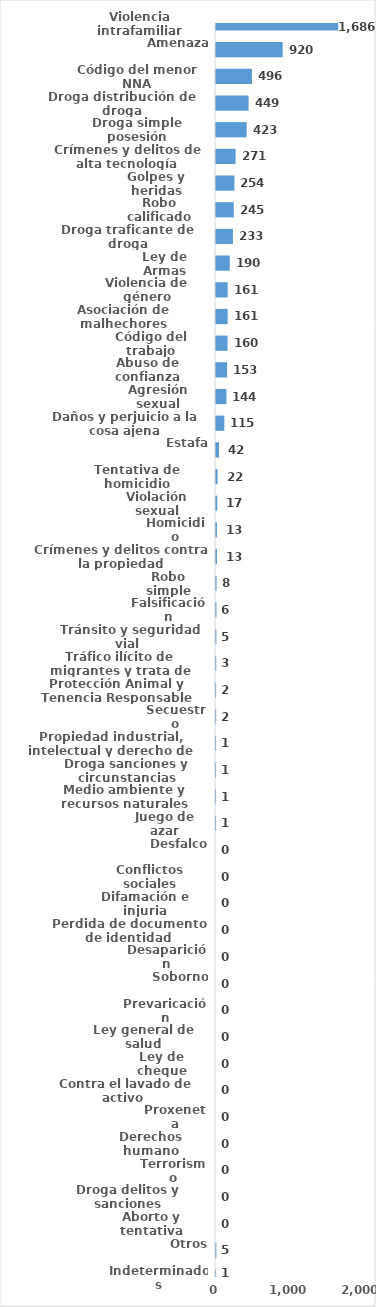
| Category | Series 0 |
|---|---|
| Violencia intrafamiliar | 1686 |
| Amenaza | 920 |
| Código del menor NNA | 496 |
| Droga distribución de droga | 449 |
| Droga simple posesión | 423 |
| Crímenes y delitos de alta tecnología | 271 |
| Golpes y heridas | 254 |
| Robo calificado | 245 |
| Droga traficante de droga | 233 |
| Ley de Armas | 190 |
| Violencia de género | 161 |
| Asociación de malhechores | 161 |
| Código del trabajo | 160 |
| Abuso de confianza | 153 |
| Agresión sexual | 144 |
| Daños y perjuicio a la cosa ajena | 115 |
| Estafa | 42 |
| Tentativa de homicidio | 22 |
| Violación sexual | 17 |
| Homicidio | 13 |
| Crímenes y delitos contra la propiedad | 13 |
| Robo simple | 8 |
| Falsificación | 6 |
| Tránsito y seguridad vial  | 5 |
| Tráfico ilícito de migrantes y trata de personas | 3 |
| Protección Animal y Tenencia Responsable | 2 |
| Secuestro | 2 |
| Propiedad industrial, intelectual y derecho de autor | 1 |
| Droga sanciones y circunstancias agravantes | 1 |
| Medio ambiente y recursos naturales | 1 |
| Juego de azar | 1 |
| Desfalco | 0 |
| Conflictos sociales | 0 |
| Difamación e injuria | 0 |
| Perdida de documento de identidad | 0 |
| Desaparición | 0 |
| Soborno | 0 |
| Prevaricación | 0 |
| Ley general de salud | 0 |
| Ley de cheque | 0 |
| Contra el lavado de activo  | 0 |
| Proxeneta | 0 |
| Derechos humano | 0 |
| Terrorismo | 0 |
| Droga delitos y sanciones | 0 |
| Aborto y tentativa | 0 |
| Otros | 5 |
| Indeterminados | 1 |